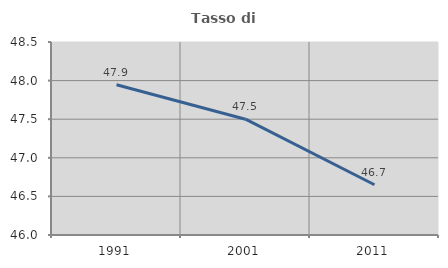
| Category | Tasso di occupazione   |
|---|---|
| 1991.0 | 47.946 |
| 2001.0 | 47.5 |
| 2011.0 | 46.651 |